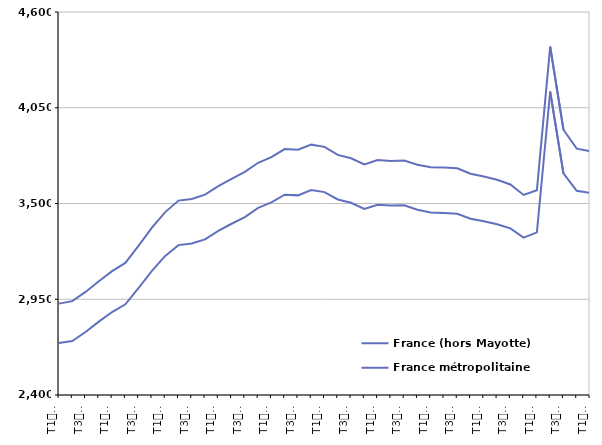
| Category | France (hors Mayotte) | France métropolitaine |
|---|---|---|
| T1
2011 | 2924.8 | 2698.6 |
| T2
2011 | 2939 | 2710.3 |
| T3
2011 | 2992.2 | 2761.8 |
| T4
2011 | 3053.8 | 2821.4 |
| T1
2012 | 3111.4 | 2876.4 |
| T2
2012 | 3158.4 | 2920.8 |
| T3
2012 | 3257.4 | 3015.3 |
| T4
2012 | 3360.9 | 3113 |
| T1
2013 | 3450.6 | 3199.2 |
| T2
2013 | 3516.7 | 3260.9 |
| T3
2013 | 3526.2 | 3270.1 |
| T4
2013 | 3550.8 | 3293.8 |
| T1
2014 | 3599.5 | 3343 |
| T2
2014 | 3641.9 | 3383.7 |
| T3
2014 | 3681.3 | 3422.1 |
| T4
2014 | 3734 | 3474.8 |
| T1
2015 | 3766 | 3506.1 |
| T2
2015 | 3812.9 | 3550.5 |
| T3
2015 | 3808.8 | 3546.7 |
| T4
2015 | 3838.1 | 3577.7 |
| T1
2016 | 3825.3 | 3565.5 |
| T2
2016 | 3779.3 | 3523.3 |
| T3
2016 | 3759.7 | 3504 |
| T4
2016 | 3724.6 | 3468.4 |
| T1
2017 | 3749.2 | 3492.3 |
| T2
2017 | 3744.8 | 3488.6 |
| T3
2017 | 3746.9 | 3489.6 |
| T4
2017 | 3723 | 3464 |
| T1
2018 | 3708.6 | 3448.7 |
| T2
2018 | 3706.6 | 3445.4 |
| T3
2018 | 3702 | 3441.1 |
| T4
2018 | 3671.2 | 3412.7 |
| T1
2019 | 3654.9 | 3397.5 |
| T2
2019 | 3636.3 | 3381.2 |
| T3
2019 | 3609.2 | 3357.3 |
| T4
2019 | 3549.3 | 3303.9 |
| T1
2020 | 3576.6 | 3334.2 |
| T2
2020 | 4400.8 | 4142.7 |
| T3
2020 | 3923.9 | 3673.2 |
| T4
2020 | 3815.2 | 3572.8 |
| T1
2021 | 3800.7 | 3560.6 |